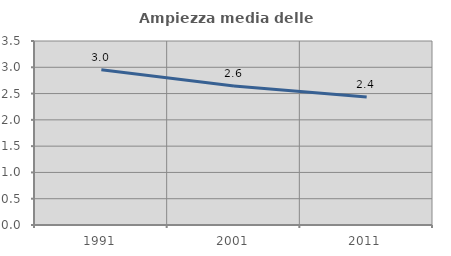
| Category | Ampiezza media delle famiglie |
|---|---|
| 1991.0 | 2.954 |
| 2001.0 | 2.645 |
| 2011.0 | 2.436 |